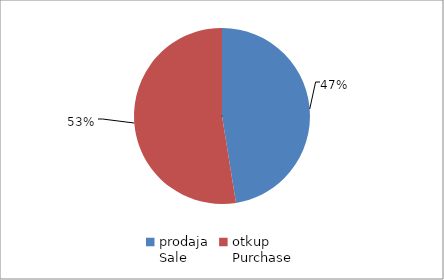
| Category | Series 0 |
|---|---|
| prodaja
Sale | 24652273 |
| otkup
Purchase | 27295051 |